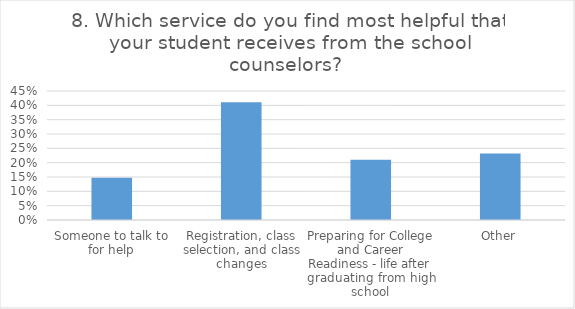
| Category | 8. Which service do you find most helpful that your student receives from the school counselors?  |
|---|---|
| Someone to talk to for help | 0.147 |
| Registration, class selection, and class changes | 0.41 |
| Preparing for College and Career Readiness - life after graduating from high school | 0.211 |
| Other | 0.232 |